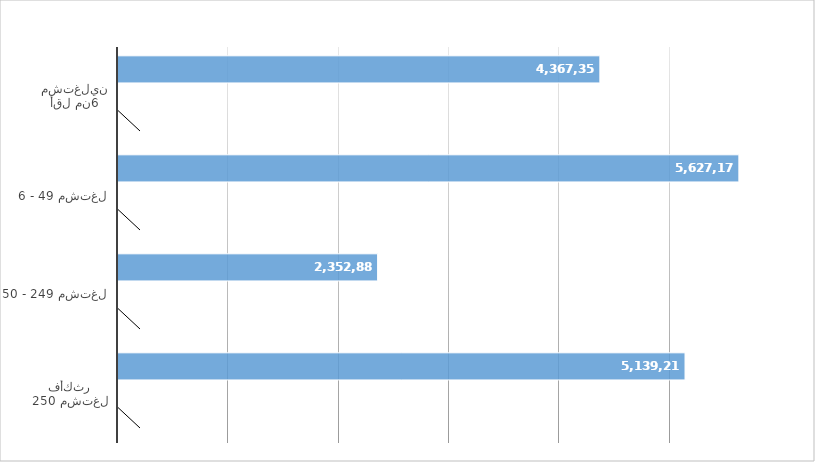
| Category | Series 0 | Series 1 | Series 2 |
|---|---|---|---|
| أقل من6 مشتغلين | 4367354 |  | 0.25 |
| 6 - 49 مشتغل | 5627175 |  | 0.322 |
| 50 - 249 مشتغل | 2352881 |  | 0.135 |
| 250 مشتغل فأكثر | 5139218 |  | 0.294 |